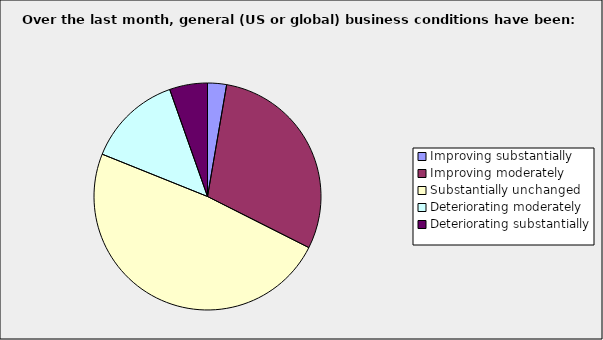
| Category | Series 0 |
|---|---|
| Improving substantially | 0.027 |
| Improving moderately | 0.297 |
| Substantially unchanged | 0.486 |
| Deteriorating moderately | 0.135 |
| Deteriorating substantially | 0.054 |